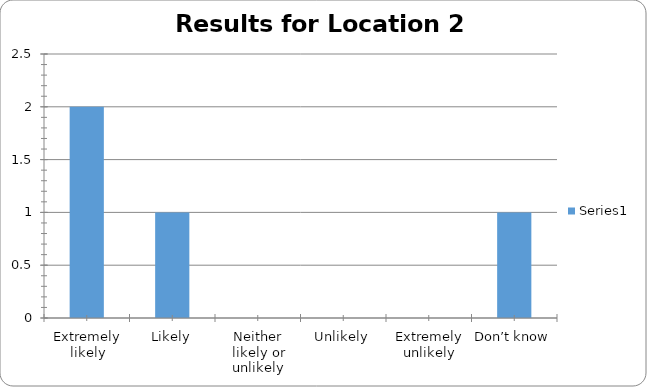
| Category | Series 0 |
|---|---|
| Extremely likely | 2 |
| Likely | 1 |
| Neither likely or unlikely | 0 |
| Unlikely | 0 |
| Extremely unlikely | 0 |
| Don’t know | 1 |